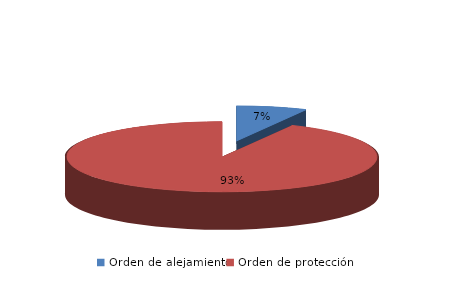
| Category | Series 0 |
|---|---|
| Orden de alejamiento | 9 |
| Orden de protección | 114 |